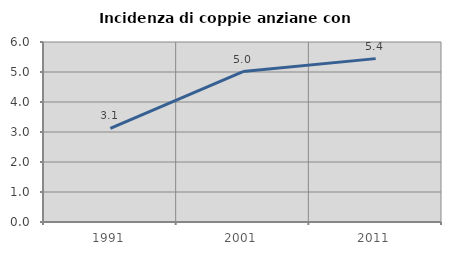
| Category | Incidenza di coppie anziane con figli |
|---|---|
| 1991.0 | 3.12 |
| 2001.0 | 5.015 |
| 2011.0 | 5.446 |